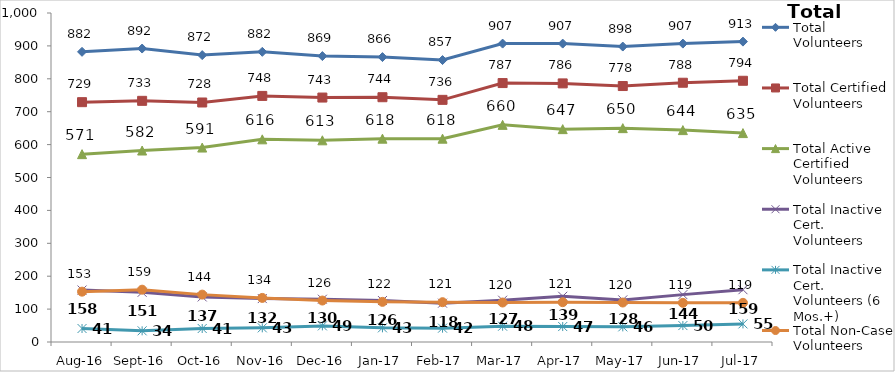
| Category | Total Volunteers | Total Certified Volunteers | Total Active Certified Volunteers | Total Inactive Cert. Volunteers | Total Inactive Cert. Volunteers (6 Mos.+) | Total Non-Case Volunteers |
|---|---|---|---|---|---|---|
| Aug-16 | 882 | 729 | 571 | 158 | 41 | 153 |
| Sep-16 | 892 | 733 | 582 | 151 | 34 | 159 |
| Oct-16 | 872 | 728 | 591 | 137 | 41 | 144 |
| Nov-16 | 882 | 748 | 616 | 132 | 43 | 134 |
| Dec-16 | 869 | 743 | 613 | 130 | 49 | 126 |
| Jan-17 | 866 | 744 | 618 | 126 | 43 | 122 |
| Feb-17 | 857 | 736 | 618 | 118 | 42 | 121 |
| Mar-17 | 907 | 787 | 660 | 127 | 48 | 120 |
| Apr-17 | 907 | 786 | 647 | 139 | 47 | 121 |
| May-17 | 898 | 778 | 650 | 128 | 46 | 120 |
| Jun-17 | 907 | 788 | 644 | 144 | 50 | 119 |
| Jul-17 | 913 | 794 | 635 | 159 | 55 | 119 |